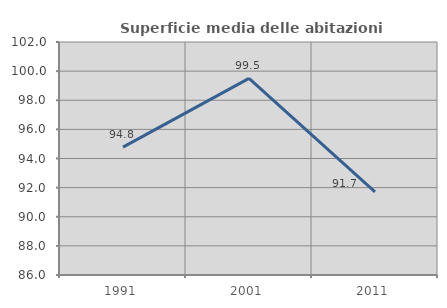
| Category | Superficie media delle abitazioni occupate |
|---|---|
| 1991.0 | 94.785 |
| 2001.0 | 99.502 |
| 2011.0 | 91.701 |